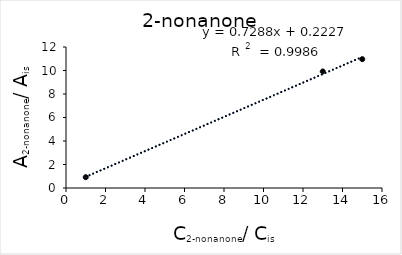
| Category | Series 0 |
|---|---|
| 1.0 | 0.92 |
| 13.0 | 9.917 |
| 15.0 | 10.965 |